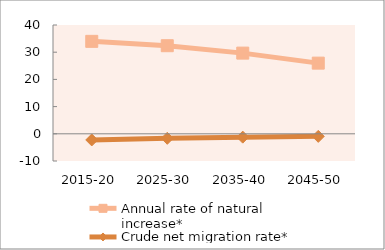
| Category | Annual rate of natural increase* | Crude net migration rate* |
|---|---|---|
| 2015-20 | 33.991 | -2.265 |
| 2025-30 | 32.387 | -1.654 |
| 2035-40 | 29.665 | -1.23 |
| 2045-50 | 25.978 | -0.941 |